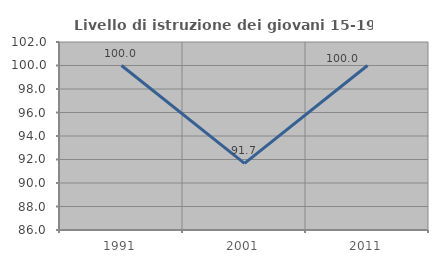
| Category | Livello di istruzione dei giovani 15-19 anni |
|---|---|
| 1991.0 | 100 |
| 2001.0 | 91.667 |
| 2011.0 | 100 |